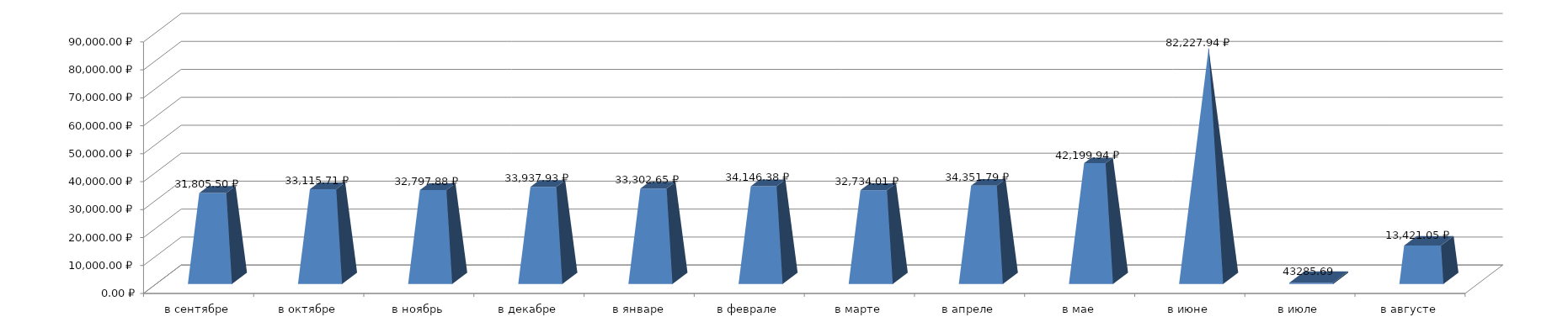
| Category | Series 0 |
|---|---|
| в сентябре | 31805.5 |
| в октябре | 33115.71 |
| в ноябрь | 32797.88 |
| в декабре | 33937.93 |
| в январе | 33302.65 |
| в феврале | 34146.38 |
| в марте | 32734.01 |
| в апреле | 34351.79 |
| в мае | 42199.94 |
| в июне | 82227.94 |
| в июле | 462.77 |
| в августе | 13421.05 |